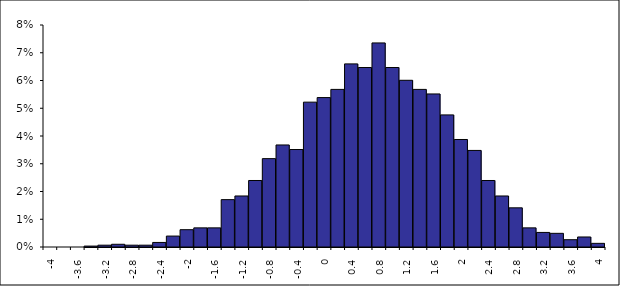
| Category | Series 0 |
|---|---|
| -4.0 | 0 |
| -3.8 | 0 |
| -3.6 | 0 |
| -3.4 | 0 |
| -3.2 | 0.001 |
| -3.0 | 0.001 |
| -2.8 | 0.001 |
| -2.6 | 0.001 |
| -2.4 | 0.002 |
| -2.2 | 0.004 |
| -2.0 | 0.006 |
| -1.8 | 0.007 |
| -1.6 | 0.007 |
| -1.4 | 0.017 |
| -1.2 | 0.018 |
| -1.0 | 0.024 |
| -0.8 | 0.032 |
| -0.6 | 0.037 |
| -0.4 | 0.035 |
| -0.2 | 0.052 |
| 0.0 | 0.054 |
| 0.2 | 0.057 |
| 0.4 | 0.066 |
| 0.6 | 0.065 |
| 0.8 | 0.074 |
| 1.0 | 0.065 |
| 1.2 | 0.06 |
| 1.4 | 0.057 |
| 1.6 | 0.055 |
| 1.80000000000001 | 0.048 |
| 2.00000000000001 | 0.039 |
| 2.20000000000001 | 0.035 |
| 2.40000000000001 | 0.024 |
| 2.60000000000001 | 0.018 |
| 2.80000000000001 | 0.014 |
| 3.00000000000001 | 0.007 |
| 3.20000000000001 | 0.005 |
| 3.40000000000001 | 0.005 |
| 3.60000000000001 | 0.003 |
| 3.80000000000001 | 0.004 |
| 4.00000000000001 | 0.001 |